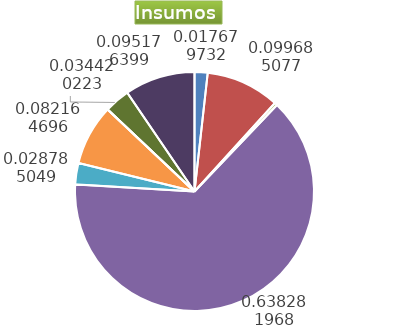
| Category | Series 0 |
|---|---|
| Control arvenses | 1149096 |
| Control fitosanitario | 6479042 |
| Cosecha y beneficio | 247426.962 |
| Fertilización | 41485203 |
| Instalación | 1870887.252 |
| Otros | 5340303 |
| Podas | 0 |
| Riego | 0 |
| Transporte | 2237146 |
| Tutorado | 6186000 |